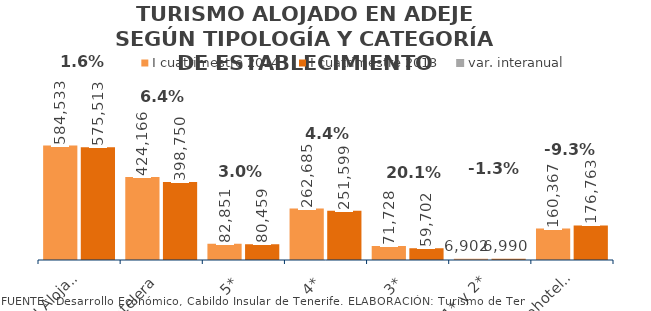
| Category | I cuatrimestre 2014 | I cuatrimestre 2013 |
|---|---|---|
| Total Alojados | 584533 | 575513 |
| Hotelera | 424166 | 398750 |
| 5* | 82851 | 80459 |
| 4* | 262685 | 251599 |
| 3* | 71728 | 59702 |
| 1* y 2* | 6902 | 6990 |
| Extrahotelera | 160367 | 176763 |